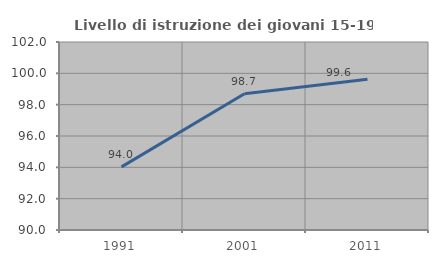
| Category | Livello di istruzione dei giovani 15-19 anni |
|---|---|
| 1991.0 | 94.03 |
| 2001.0 | 98.697 |
| 2011.0 | 99.621 |